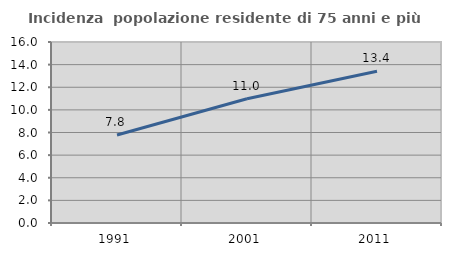
| Category | Incidenza  popolazione residente di 75 anni e più |
|---|---|
| 1991.0 | 7.78 |
| 2001.0 | 10.978 |
| 2011.0 | 13.413 |